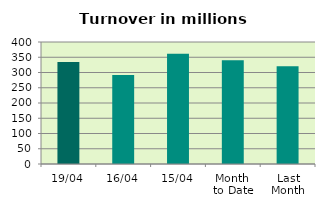
| Category | Series 0 |
|---|---|
| 19/04 | 334.378 |
| 16/04 | 292.086 |
| 15/04 | 361.229 |
| Month 
to Date | 340.282 |
| Last
Month | 320.663 |